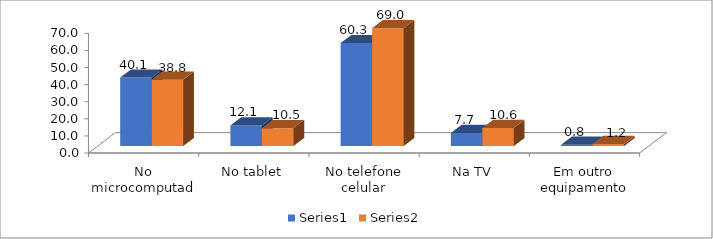
| Category | Series 0 | Series 1 |
|---|---|---|
| No microcomputador | 40.1 | 38.8 |
| No tablet | 12.1 | 10.5 |
| No telefone celular | 60.3 | 69 |
| Na TV | 7.7 | 10.6 |
| Em outro equipamento | 0.8 | 1.2 |